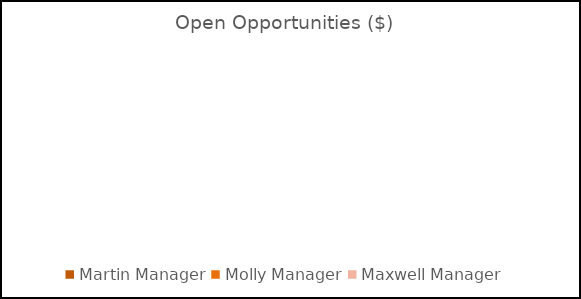
| Category | Open Opportunities  |
|---|---|
| Martin Manager | 0 |
| Molly Manager | 0 |
| Maxwell Manager  | 0 |